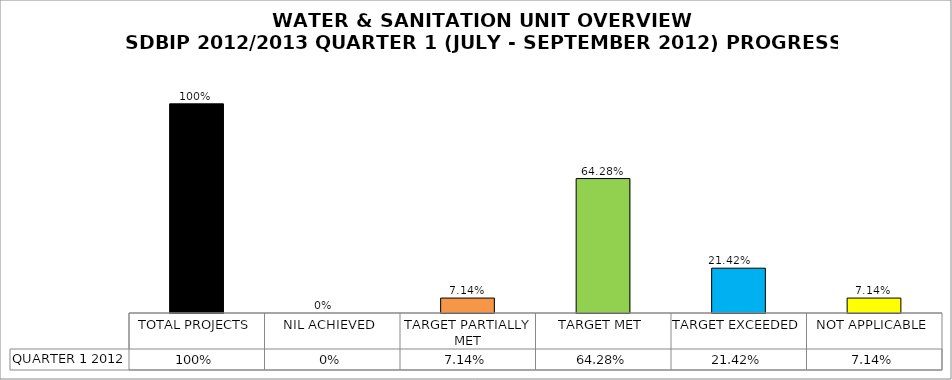
| Category | QUARTER 1 2012 |
|---|---|
| TOTAL PROJECTS | 1 |
| NIL ACHIEVED | 0 |
| TARGET PARTIALLY MET | 0.071 |
| TARGET MET | 0.643 |
| TARGET EXCEEDED | 0.214 |
| NOT APPLICABLE | 0.071 |